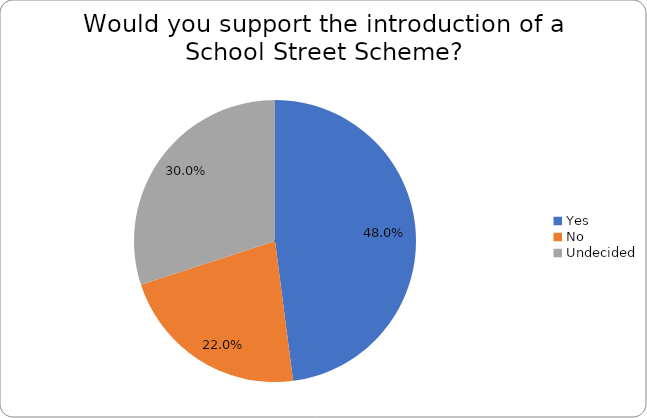
| Category | Series 0 |
|---|---|
| Yes | 0.48 |
| No | 0.22 |
| Undecided | 0.3 |